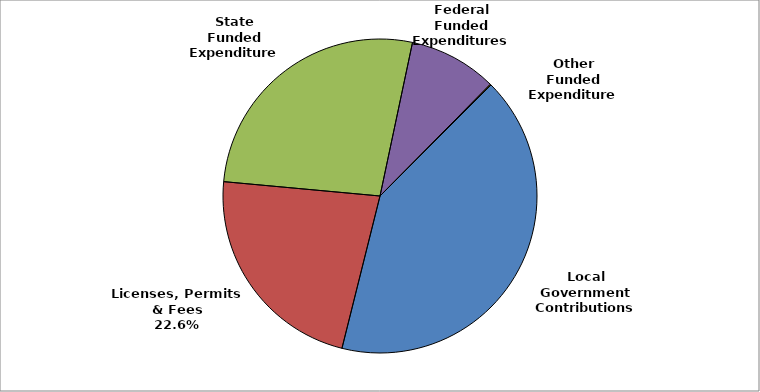
| Category | Series 0 |
|---|---|
| Local Government Contributions | 0.414 |
| Licenses, Permits & Fees | 0.226 |
| State Funded Expenditures | 0.269 |
| Federal Funded Expenditures | 0.091 |
| Other Funded Expenditures | 0.001 |